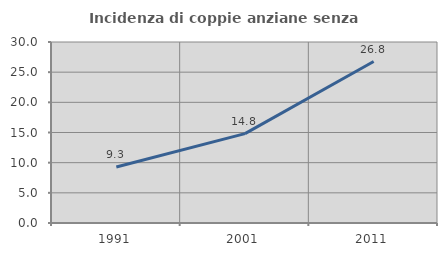
| Category | Incidenza di coppie anziane senza figli  |
|---|---|
| 1991.0 | 9.278 |
| 2001.0 | 14.815 |
| 2011.0 | 26.761 |